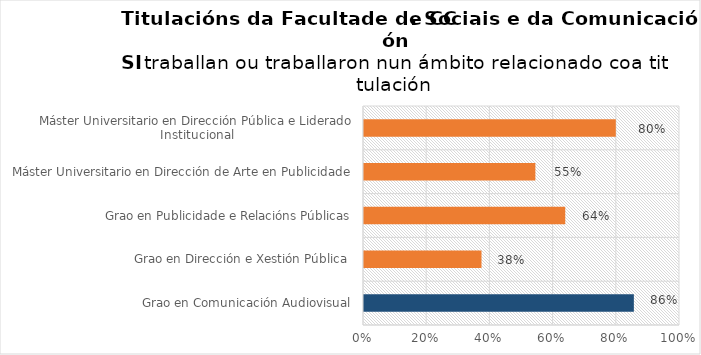
| Category | Series 0 |
|---|---|
| Grao en Comunicación Audiovisual | 0.857 |
| Grao en Dirección e Xestión Pública  | 0.375 |
| Grao en Publicidade e Relacións Públicas | 0.64 |
| Máster Universitario en Dirección de Arte en Publicidade | 0.545 |
| Máster Universitario en Dirección Pública e Liderado Institucional | 0.8 |